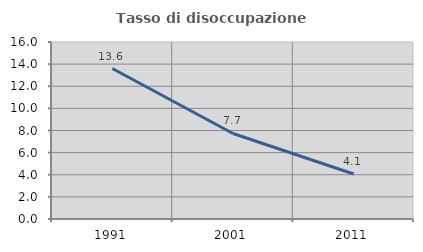
| Category | Tasso di disoccupazione giovanile  |
|---|---|
| 1991.0 | 13.6 |
| 2001.0 | 7.732 |
| 2011.0 | 4.065 |